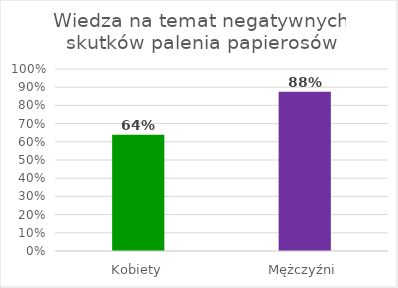
| Category | Wiedza na temat negatywnych skutków palenia papierosów |
|---|---|
| Kobiety | 0.639 |
| Mężczyźni | 0.875 |